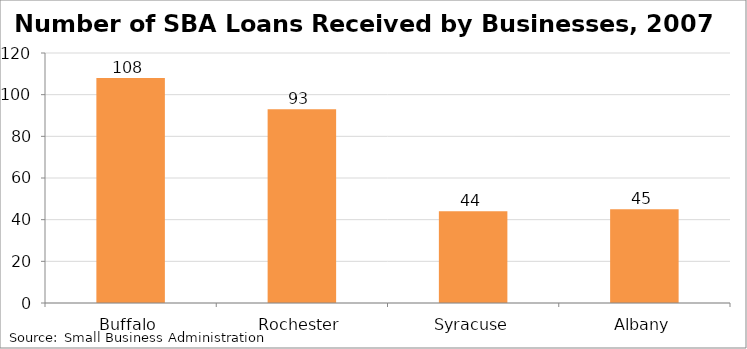
| Category | Number of SBA Loans Received by Businesses |
|---|---|
| Buffalo | 108 |
| Rochester | 93 |
| Syracuse | 44 |
| Albany | 45 |